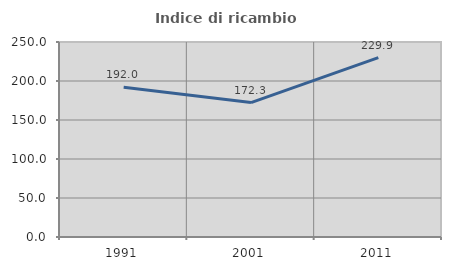
| Category | Indice di ricambio occupazionale  |
|---|---|
| 1991.0 | 191.964 |
| 2001.0 | 172.34 |
| 2011.0 | 229.944 |